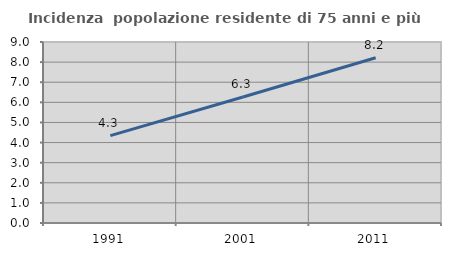
| Category | Incidenza  popolazione residente di 75 anni e più |
|---|---|
| 1991.0 | 4.347 |
| 2001.0 | 6.264 |
| 2011.0 | 8.219 |